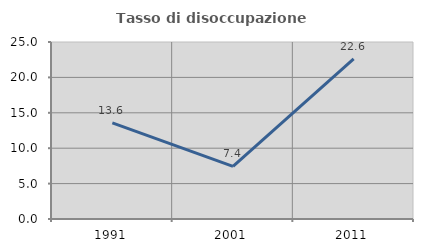
| Category | Tasso di disoccupazione giovanile  |
|---|---|
| 1991.0 | 13.569 |
| 2001.0 | 7.438 |
| 2011.0 | 22.632 |